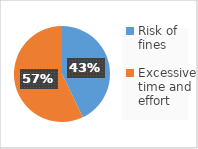
| Category | Series 0 |
|---|---|
| Risk of fines | 3 |
| Excessive time and effort | 4 |